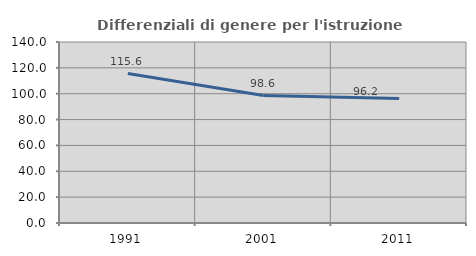
| Category | Differenziali di genere per l'istruzione superiore |
|---|---|
| 1991.0 | 115.618 |
| 2001.0 | 98.572 |
| 2011.0 | 96.223 |